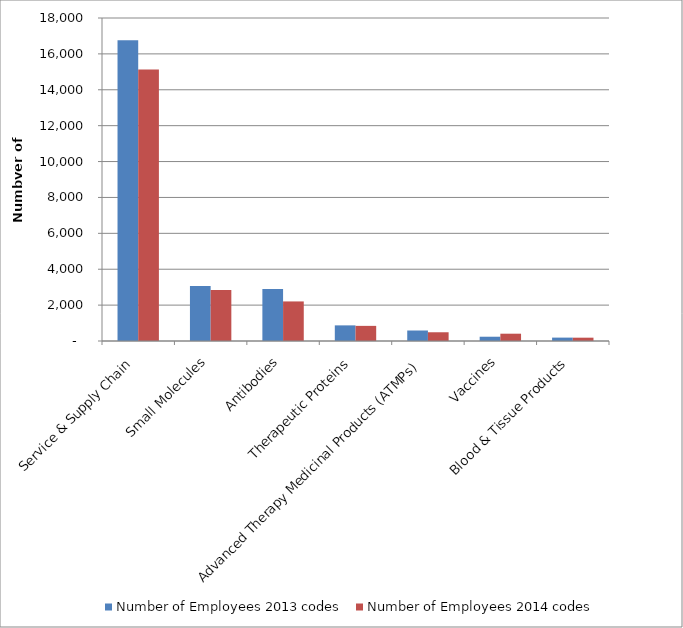
| Category | Number of Employees 2013 codes | Number of Employees 2014 codes |
|---|---|---|
| Service & Supply Chain | 16765.28 | 15134 |
| Small Molecules | 3063.7 | 2840 |
| Antibodies | 2892 | 2205 |
| Therapeutic Proteins | 871.03 | 843 |
| Advanced Therapy Medicinal Products (ATMPs) | 585 | 487 |
| Vaccines | 238.4 | 407 |
| Blood & Tissue Products | 189 | 185 |